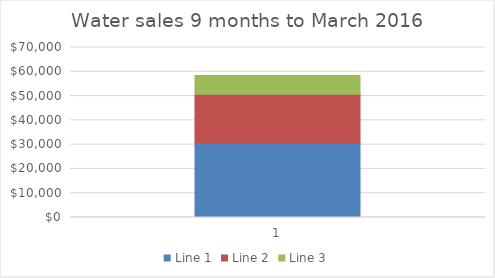
| Category | Line 1 | Line 2 | Line 3 |
|---|---|---|---|
| 0 | 30689 | 20021 | 7778 |